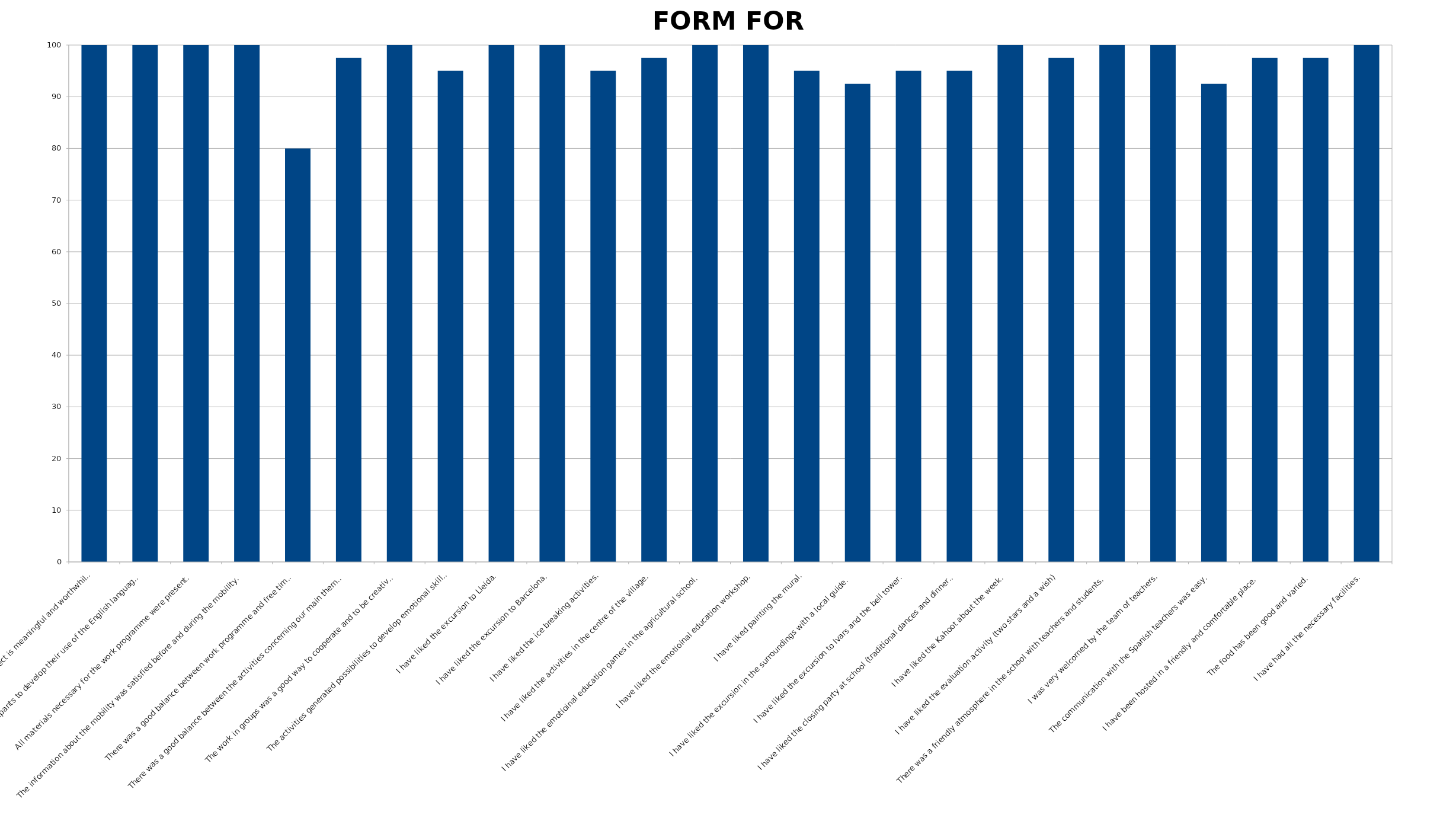
| Category | Series 0 |
|---|---|
| The project is meaningful and worthwhile. | 100 |
| The mobility motivate the participants to develop their use of the English language. | 100 |
| All materials necessary for the work programme were present. | 100 |
| The information about the mobility was satisfied before and during the mobility. | 100 |
| There was a good balance between work programme and free time. | 80 |
| There was a good balance between the activities concerning our main theme. | 97.5 |
| The work in groups was a good way to cooperate and to be creative. | 100 |
| The activities generated possibilities to develop emotional skills. | 95 |
| I have liked the excursion to Lleida. | 100 |
| I have liked the excursion to Barcelona. | 100 |
| I have liked the ice breaking activities. | 95 |
| I have liked the activities in the centre of the village. | 97.5 |
| I have liked the emotioinal education games in the agricultural school.  | 100 |
| I have liked the emotioinal education workshop. | 100 |
| I have liked painting the mural. | 95 |
| I have liked the excursion in the surroundings with a local guide.  | 92.5 |
| I have liked the excursion to Ivars and the bell tower.  | 95 |
| I have liked the closing party at school (traditional dances and dinner). | 95 |
| I have liked the Kahoot about the week.  | 100 |
| I have liked the evaluation activity (two stars and a wish) | 97.5 |
| There was a friendly atmosphere in the school with teachers and students.  | 100 |
| I was very welcomed by the team of teachers. | 100 |
| The communication with the Spanish teachers was easy. | 92.5 |
| I have been hosted in a friendly and comfortable place.  | 97.5 |
| The food has been good and varied.  | 97.5 |
| I have had all the necessary facilities.  | 100 |